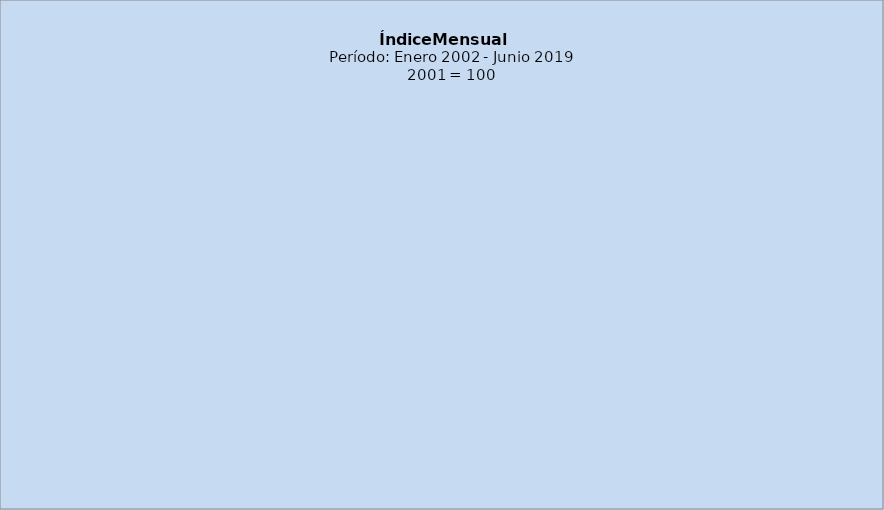
| Category | Serie Original | Serie Tendencia-ciclo |
|---|---|---|
| 2002 | 103.428 | 101.515 |
| f | 82.682 | 102.6 |
| m | 89.359 | 103.598 |
| a | 89.12 | 104.401 |
| m | 111.367 | 105.081 |
| j | 87.842 | 105.65 |
| j | 88.532 | 106.103 |
| a | 89.145 | 106.371 |
| s | 129.834 | 106.418 |
| o | 134.607 | 106.271 |
| n | 133.189 | 105.987 |
| d | 125.156 | 105.745 |
| 2003 | 106.817 | 105.762 |
| f | 89.293 | 106.131 |
| m | 89.661 | 106.682 |
| a | 92.914 | 107.429 |
| m | 107.4 | 108.115 |
| j | 95.532 | 108.546 |
| j | 87.495 | 108.778 |
| a | 93.816 | 108.872 |
| s | 132.762 | 108.894 |
| o | 132.74 | 108.83 |
| n | 136.9 | 108.715 |
| d | 130.665 | 108.532 |
| 2004 | 109.561 | 108.442 |
| f | 90.765 | 108.497 |
| m | 90.381 | 108.756 |
| a | 94.807 | 109.17 |
| m | 110.2 | 109.873 |
| j | 97.585 | 111.017 |
| j | 90.517 | 112.475 |
| a | 98.177 | 114.053 |
| s | 137.993 | 115.539 |
| o | 144.683 | 116.707 |
| n | 144.33 | 117.512 |
| d | 140.787 | 117.824 |
| 2005 | 115.624 | 117.714 |
| f | 100.375 | 117.285 |
| m | 99.726 | 116.802 |
| a | 101.369 | 116.355 |
| m | 113.739 | 115.888 |
| j | 101.656 | 115.323 |
| j | 93.965 | 114.728 |
| a | 101.733 | 114.098 |
| s | 135.822 | 113.387 |
| o | 136.043 | 112.752 |
| n | 136.405 | 112.345 |
| d | 142.044 | 112.382 |
| 2006 | 115.099 | 112.844 |
| f | 94.133 | 113.618 |
| m | 100.613 | 114.555 |
| a | 97.852 | 115.384 |
| m | 118.149 | 115.988 |
| j | 99.425 | 116.329 |
| j | 98.644 | 116.489 |
| a | 100.637 | 116.698 |
| s | 137.221 | 117.309 |
| o | 141.325 | 118.351 |
| n | 147.339 | 119.688 |
| d | 145.321 | 121.108 |
| 2007 | 127.479 | 122.303 |
| f | 108.821 | 123.186 |
| m | 104.457 | 123.683 |
| a | 107.924 | 124.007 |
| m | 121.42 | 124.261 |
| j | 110.311 | 124.502 |
| j | 105.175 | 124.612 |
| a | 109.492 | 124.455 |
| s | 145.86 | 123.934 |
| o | 139.175 | 123.095 |
| n | 152.032 | 122.176 |
| d | 145.665 | 121.381 |
| 2008 | 127.915 | 120.96 |
| f | 102.967 | 121.005 |
| m | 103.353 | 121.581 |
| a | 99.062 | 122.673 |
| m | 122.854 | 124.106 |
| j | 113.294 | 125.559 |
| j | 105.132 | 126.638 |
| a | 112.204 | 127.125 |
| s | 148.486 | 127.016 |
| o | 150.978 | 126.625 |
| n | 152.773 | 126.256 |
| d | 151.877 | 126.074 |
| 2009 | 132.754 | 126.146 |
| f | 111.258 | 126.361 |
| m | 109.703 | 126.603 |
| a | 108.085 | 126.831 |
| m | 124.994 | 127.08 |
| j | 111.303 | 127.464 |
| j | 105.13 | 128.143 |
| a | 113.672 | 129.209 |
| s | 151.393 | 130.487 |
| o | 154.366 | 131.674 |
| n | 163.072 | 132.483 |
| d | 161.882 | 132.698 |
| 2010 | 141.124 | 132.226 |
| f | 112.723 | 131.164 |
| m | 111.939 | 129.832 |
| a | 110.065 | 128.519 |
| m | 127.086 | 127.609 |
| j | 109.153 | 127.236 |
| j | 102.78 | 127.222 |
| a | 110.899 | 127.358 |
| s | 147.934 | 127.541 |
| o | 153.351 | 127.739 |
| n | 157.522 | 127.918 |
| d | 159.17 | 128.284 |
| 2011 | 137.355 | 128.988 |
| f | 113.259 | 130.132 |
| m | 112.765 | 131.589 |
| a | 114.111 | 133.096 |
| m | 136.815 | 134.363 |
| j | 116.479 | 135.283 |
| j | 111.357 | 135.947 |
| a | 117.11 | 136.34 |
| s | 157.168 | 136.529 |
| o | 164.654 | 136.638 |
| n | 170.86 | 136.682 |
| d | 169.376 | 136.645 |
| 2012 | 142.111 | 136.654 |
| f | 120.132 | 136.921 |
| m | 120.2 | 137.524 |
| a | 113.734 | 138.579 |
| m | 140.538 | 140.005 |
| j | 124.564 | 141.614 |
| j | 111.949 | 143.183 |
| a | 123.347 | 144.596 |
| s | 167.997 | 145.755 |
| o | 174.594 | 146.603 |
| n | 180.438 | 147.165 |
| d | 181.79 | 147.358 |
| 2013 | 154.157 | 147.216 |
| f | 131.836 | 146.881 |
| m | 131.009 | 146.629 |
| a | 125.935 | 146.607 |
| m | 145.775 | 146.855 |
| j | 127.825 | 147.397 |
| j | 119.537 | 148.175 |
| a | 131.763 | 149.002 |
| s | 168.605 | 149.638 |
| o | 173.033 | 150.024 |
| n | 184.27 | 150.349 |
| d | 188.378 | 150.859 |
| 2014 | 157.34 | 151.554 |
| f | 135.694 | 152.309 |
| m | 138.255 | 152.978 |
| a | 134.76 | 153.431 |
| m | 153.154 | 153.623 |
| j | 131.32 | 153.478 |
| j | 124.049 | 153.102 |
| a | 134.053 | 152.789 |
| s | 171.842 | 152.804 |
| o | 174.781 | 153.268 |
| n  | 188.946 | 154.139 |
| d | 194.432 | 155.282 |
| 2015 | 163.21 | 156.464 |
| f | 141.484 | 157.425 |
| m | 143.2 | 157.922 |
| a | 138.167 | 157.939 |
| m | 156.632 | 157.594 |
| j | 135.267 | 157.132 |
| j | 127.014 | 156.806 |
| a | 137.507 | 156.849 |
| s | 175.825 | 157.382 |
| o | 180.284 | 158.338 |
| n  | 196.512 | 159.507 |
| d | 201.486 | 160.642 |
| 2016 | 167.857 | 161.56 |
| f | 144.587 | 162.099 |
| m | 145.412 | 162.304 |
| a | 141.361 | 162.336 |
| m | 162.191 | 162.33 |
| j | 140.864 | 162.42 |
| j | 129.64 | 162.669 |
| a | 145.049 | 163.021 |
| s | 182.052 | 163.489 |
| o | 184.356 | 164.025 |
| n | 204.753 | 164.544 |
| d | 207.632 | 165.002 |
| 2017 | 170.373 | 165.364 |
| f | 150.419 | 165.641 |
| m | 148.532 | 165.982 |
| a | 144.122 | 166.458 |
| m | 164.116 | 167.115 |
| j | 144.615 | 167.835 |
| j | 136.539 | 168.496 |
| a | 150.273 | 168.98 |
| s | 186.532 | 169.207 |
| o | 192.965 | 169.184 |
| n | 212.638 | 168.998 |
| d | 211.676 | 168.793 |
| 2018 | 172.39 | 168.793 |
| f | 152.952 | 169.096 |
| m | 150.995 | 169.624 |
| a | 146.876 | 170.295 |
| m | 173.707 | 171.005 |
| j | 150.453 | 171.62 |
| j | 136.839 | 172.089 |
| a | 153.264 | 172.428 |
| s | 193.926 | 172.681 |
| o | 201.528 | 172.843 |
| n | 214.324 | 172.894 |
| d | 216.224 | 172.829 |
| 2019 | 177.025 | 172.705 |
| f | 155.826 | 172.688 |
| m | 153.695 | 172.908 |
| a | 148.062 | 173.386 |
| m | 179.574 | 174.119 |
| j | 152.832 | 175.084 |